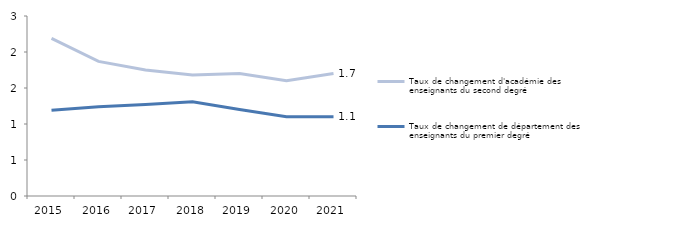
| Category | Taux de changement d'académie des enseignants du second degré | Taux de changement de département des enseignants du premier degré |
|---|---|---|
| 2015 | 2.19 | 1.19 |
| 2016 | 1.87 | 1.24 |
| 2017 | 1.75 | 1.27 |
| 2018 | 1.68 | 1.31 |
| 2019 | 1.7 | 1.2 |
| 2020 | 1.6 | 1.1 |
| 2021 | 1.7 | 1.1 |